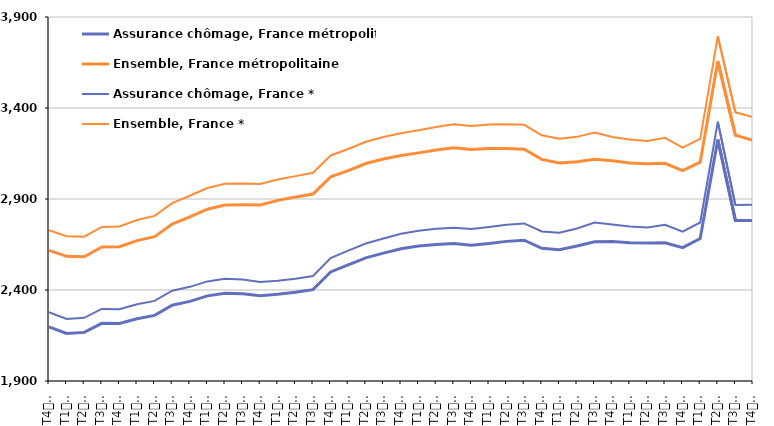
| Category | Assurance chômage, France métropolitaine | Ensemble, France métropolitaine | Assurance chômage, France * | Ensemble, France * |
|---|---|---|---|---|
| T4
2010 | 2197.5 | 2618.1 | 2277.7 | 2728.4 |
| T1
2011 | 2160.9 | 2584.8 | 2240.8 | 2695.6 |
| T2
2011 | 2167.1 | 2582.2 | 2247.1 | 2693 |
| T3
2011 | 2216.8 | 2636.3 | 2296 | 2746.6 |
| T4
2011 | 2216 | 2637.9 | 2294.9 | 2749.3 |
| T1
2012 | 2242.1 | 2671.5 | 2321.3 | 2784.3 |
| T2
2012 | 2260.5 | 2693.2 | 2340.2 | 2807.2 |
| T3
2012 | 2316.1 | 2762.2 | 2396.2 | 2877.6 |
| T4
2012 | 2337.5 | 2801.5 | 2417.4 | 2917.7 |
| T1
2013 | 2367.8 | 2843.7 | 2447.3 | 2960.5 |
| T2
2013 | 2382.7 | 2867.2 | 2461.6 | 2984.3 |
| T3
2013 | 2379.9 | 2868.3 | 2457.9 | 2985 |
| T4
2013 | 2368 | 2867.5 | 2444 | 2982.8 |
| T1
2014 | 2376.6 | 2892.6 | 2451.1 | 3007.5 |
| T2
2014 | 2388.1 | 2911.3 | 2462 | 3025.7 |
| T3
2014 | 2401.9 | 2927.3 | 2477 | 3044.2 |
| T4
2014 | 2499 | 3021.9 | 2575.9 | 3139.2 |
| T1
2015 | 2537.9 | 3056.1 | 2616.1 | 3174.8 |
| T2
2015 | 2576.4 | 3094.9 | 2655.6 | 3214.4 |
| T3
2015 | 2602.7 | 3119.5 | 2683.2 | 3240.7 |
| T4
2015 | 2626.7 | 3139.4 | 2709 | 3261.5 |
| T1
2016 | 2641.9 | 3153.4 | 2726 | 3277.2 |
| T2
2016 | 2650.6 | 3169.4 | 2736.2 | 3295.6 |
| T3
2016 | 2655.1 | 3182.1 | 2741.6 | 3310.2 |
| T4
2016 | 2646.4 | 3172.1 | 2735.2 | 3301.1 |
| T1
2017 | 2655.2 | 3178 | 2746.3 | 3309.6 |
| T2
2017 | 2667.2 | 3177.8 | 2759.1 | 3310.7 |
| T3
2017 | 2673.4 | 3173.6 | 2765.9 | 3307.8 |
| T4
2017 | 2629.3 | 3117.5 | 2721.7 | 3249.7 |
| T1
2018 | 2620.8 | 3097.4 | 2714.4 | 3230.9 |
| T2
2018 | 2641.7 | 3105.1 | 2738.2 | 3241.4 |
| T3
2018 | 2665.3 | 3118.9 | 2770.8 | 3264.7 |
| T4
2018 | 2666.7 | 3109.8 | 2759.3 | 3240.8 |
| T1
2019 | 2659.7 | 3097.8 | 2749.3 | 3226.6 |
| T2
2019 | 2657.8 | 3093.9 | 2742.8 | 3218.7 |
| T3
2019 | 2659.1 | 3096.3 | 2758.2 | 3236.4 |
| T4
2019 | 2633 | 3055.4 | 2720.7 | 3182.7 |
| T1
2020 | 2682.7 | 3102.3 | 2770.9 | 3230.2 |
| T2
2020 | 3227.1 | 3657.1 | 3324.2 | 3793.8 |
| T3
2020 | 2782.5 | 3250 | 2867.3 | 3376.3 |
| T4
2020 | 2781.7 | 3222.5 | 2868.1 | 3350.6 |